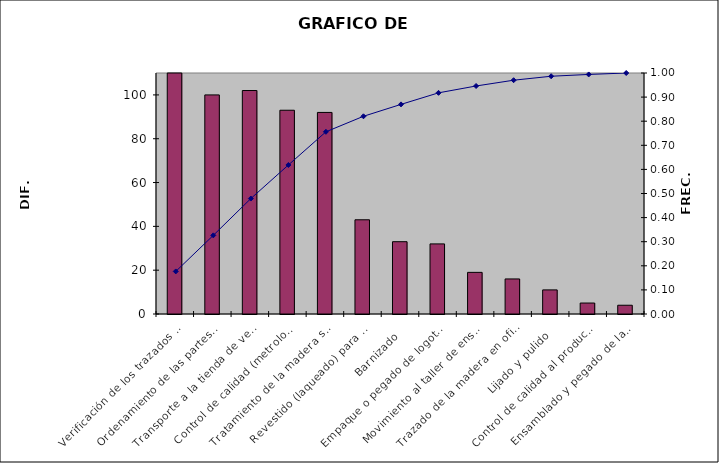
| Category | Diferencia TR-TS |
|---|---|
| Verificación de los trazados por el supervisor | 118 |
| Ordenamiento de las partes para ensamble | 100 |
| Transporte a la tienda de venta | 102 |
| Control de calidad (metrología de los trazados) | 93 |
| Tratamiento de la madera seca. | 92 |
| Revestido (laqueado) para proceso de pintura | 43 |
| Barnizado | 33 |
| Empaque o pegado de logotipo y cód. de barras | 32 |
| Movimiento al taller de ensamble | 19 |
| Trazado de la madera en oficina de diseño | 16 |
| Lijado y pulido | 11 |
| Control de calidad al producto acabado | 5 |
| Ensamblado y pegado de las partes | 4 |